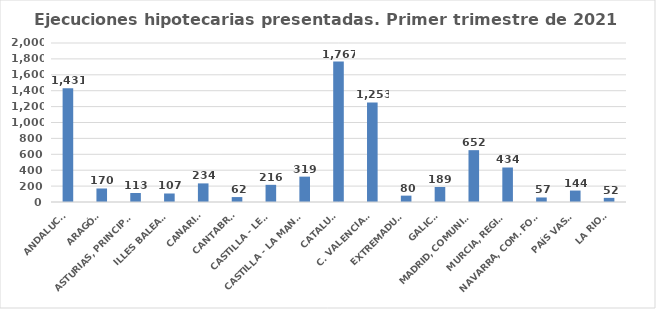
| Category | 616 |
|---|---|
| ANDALUCÍA | 1431 |
| ARAGÓN | 170 |
| ASTURIAS, PRINCIPADO | 113 |
| ILLES BALEARS | 107 |
| CANARIAS | 234 |
| CANTABRIA | 62 |
| CASTILLA - LEÓN | 216 |
| CASTILLA - LA MANCHA | 319 |
| CATALUÑA | 1767 |
| C. VALENCIANA | 1253 |
| EXTREMADURA | 80 |
| GALICIA | 189 |
| MADRID, COMUNIDAD | 652 |
| MURCIA, REGIÓN | 434 |
| NAVARRA, COM. FORAL | 57 |
| PAÍS VASCO | 144 |
| LA RIOJA | 52 |